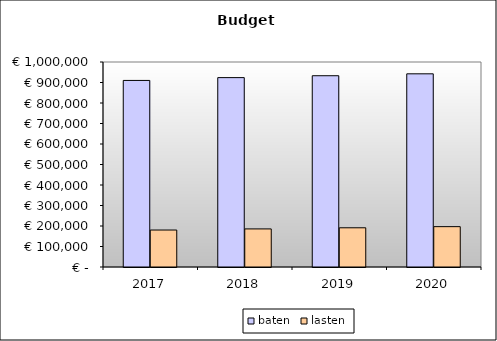
| Category | baten | lasten |
|---|---|---|
| 2017.0 | 910117.937 | 180384.893 |
| 2018.0 | 923833.41 | 185774.629 |
| 2019.0 | 933074.543 | 191279.837 |
| 2020.0 | 942315.676 | 196851.646 |